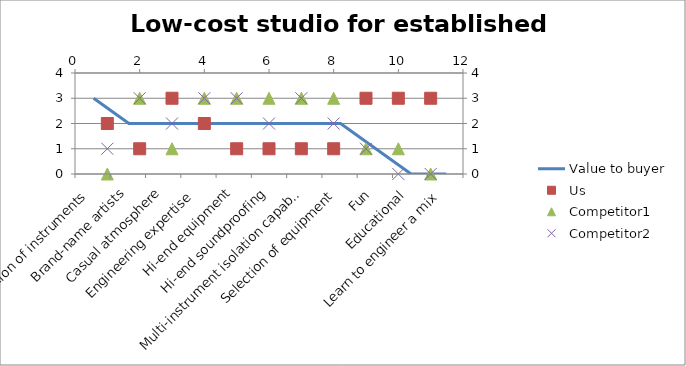
| Category | Value to buyer |
|---|---|
| Selection of instruments | 3 |
| Brand-name artists | 2 |
| Casual atmosphere | 2 |
| Engineering expertise | 2 |
| Hi-end equipment | 2 |
| Hi-end soundproofing | 2 |
| Multi-instrument isolation capability | 2 |
| Selection of equipment | 2 |
| Fun | 1 |
| Educational | 0 |
| Learn to engineer a mix | 0 |